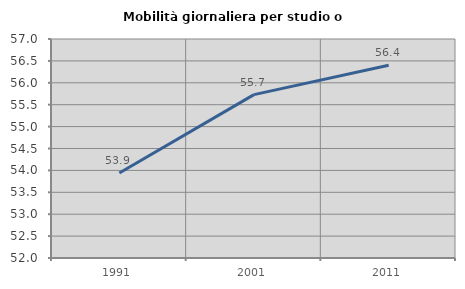
| Category | Mobilità giornaliera per studio o lavoro |
|---|---|
| 1991.0 | 53.94 |
| 2001.0 | 55.73 |
| 2011.0 | 56.401 |